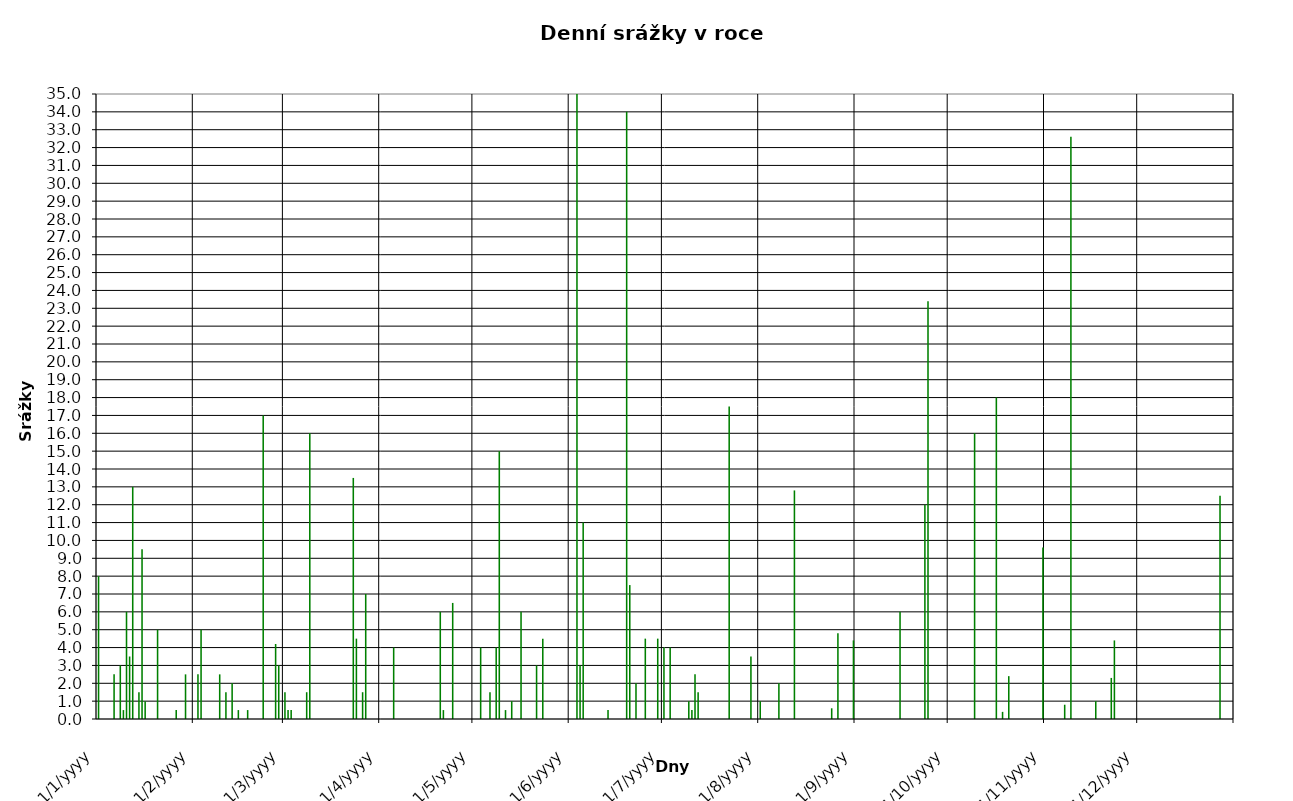
| Category | Series 0 |
|---|---|
| 2004-01-01 | 8 |
| 2004-01-02 | 0 |
| 2004-01-03 | 0 |
| 2004-01-04 | 0 |
| 2004-01-05 | 0 |
| 2004-01-06 | 2.5 |
| 2004-01-07 | 0 |
| 2004-01-08 | 3 |
| 2004-01-09 | 0.5 |
| 2004-01-10 | 6 |
| 2004-01-11 | 3.5 |
| 2004-01-12 | 13 |
| 2004-01-13 | 0 |
| 2004-01-14 | 1.5 |
| 2004-01-15 | 9.5 |
| 2004-01-16 | 1 |
| 2004-01-17 | 0 |
| 2004-01-18 | 0 |
| 2004-01-19 | 0 |
| 2004-01-20 | 5 |
| 2004-01-21 | 0 |
| 2004-01-22 | 0 |
| 2004-01-23 | 0 |
| 2004-01-24 | 0 |
| 2004-01-25 | 0 |
| 2004-01-26 | 0.5 |
| 2004-01-27 | 0 |
| 2004-01-28 | 0 |
| 2004-01-29 | 2.5 |
| 2004-01-30 | 0 |
| 2004-01-31 | 0 |
| 2004-02-01 | 0 |
| 2004-02-02 | 2.5 |
| 2004-02-03 | 5 |
| 2004-02-04 | 0 |
| 2004-02-05 | 0 |
| 2004-02-06 | 0 |
| 2004-02-07 | 0 |
| 2004-02-08 | 0 |
| 2004-02-09 | 2.5 |
| 2004-02-10 | 0 |
| 2004-02-11 | 1.5 |
| 2004-02-12 | 0 |
| 2004-02-13 | 2 |
| 2004-02-14 | 0 |
| 2004-02-15 | 0.5 |
| 2004-02-16 | 0 |
| 2004-02-17 | 0 |
| 2004-02-18 | 0.5 |
| 2004-02-19 | 0 |
| 2004-02-20 | 0 |
| 2004-02-21 | 0 |
| 2004-02-22 | 0 |
| 2004-02-23 | 17 |
| 2004-02-24 | 0 |
| 2004-02-25 | 0 |
| 2004-02-26 | 0 |
| 2004-02-27 | 4.2 |
| 2004-02-28 | 3 |
| 2004-02-29 | 0 |
| 2004-03-01 | 1.5 |
| 2004-03-02 | 0.5 |
| 2004-03-03 | 0.5 |
| 2004-03-04 | 0 |
| 2004-03-05 | 0 |
| 2004-03-06 | 0 |
| 2004-03-07 | 0 |
| 2004-03-08 | 1.5 |
| 2004-03-09 | 16 |
| 2004-03-10 | 0 |
| 2004-03-11 | 0 |
| 2004-03-12 | 0 |
| 2004-03-13 | 0 |
| 2004-03-14 | 0 |
| 2004-03-15 | 0 |
| 2004-03-16 | 0 |
| 2004-03-17 | 0 |
| 2004-03-18 | 0 |
| 2004-03-19 | 0 |
| 2004-03-20 | 0 |
| 2004-03-21 | 0 |
| 2004-03-22 | 0 |
| 2004-03-23 | 13.5 |
| 2004-03-24 | 4.5 |
| 2004-03-25 | 0 |
| 2004-03-26 | 1.5 |
| 2004-03-27 | 7 |
| 2004-03-28 | 0 |
| 2004-03-29 | 0 |
| 2004-03-30 | 0 |
| 2004-03-31 | 0 |
| 2004-04-01 | 0 |
| 2004-04-02 | 0 |
| 2004-04-03 | 0 |
| 2004-04-04 | 0 |
| 2004-04-05 | 4 |
| 2004-04-06 | 0 |
| 2004-04-07 | 0 |
| 2004-04-08 | 0 |
| 2004-04-09 | 0 |
| 2004-04-10 | 0 |
| 2004-04-11 | 0 |
| 2004-04-12 | 0 |
| 2004-04-13 | 0 |
| 2004-04-14 | 0 |
| 2004-04-15 | 0 |
| 2004-04-16 | 0 |
| 2004-04-17 | 0 |
| 2004-04-18 | 0 |
| 2004-04-19 | 0 |
| 2004-04-20 | 6 |
| 2004-04-21 | 0.5 |
| 2004-04-22 | 0 |
| 2004-04-23 | 0 |
| 2004-04-24 | 6.5 |
| 2004-04-25 | 0 |
| 2004-04-26 | 0 |
| 2004-04-27 | 0 |
| 2004-04-28 | 0 |
| 2004-04-29 | 0 |
| 2004-04-30 | 0 |
| 2004-05-01 | 0 |
| 2004-05-02 | 0 |
| 2004-05-03 | 4 |
| 2004-05-04 | 0 |
| 2004-05-05 | 0 |
| 2004-05-06 | 1.5 |
| 2004-05-07 | 0 |
| 2004-05-08 | 4 |
| 2004-05-09 | 15 |
| 2004-05-10 | 0 |
| 2004-05-11 | 0.5 |
| 2004-05-12 | 0 |
| 2004-05-13 | 1 |
| 2004-05-14 | 0 |
| 2004-05-15 | 0 |
| 2004-05-16 | 6 |
| 2004-05-17 | 0 |
| 2004-05-18 | 0 |
| 2004-05-19 | 0 |
| 2004-05-20 | 0 |
| 2004-05-21 | 3 |
| 2004-05-22 | 0 |
| 2004-05-23 | 4.5 |
| 2004-05-24 | 0 |
| 2004-05-25 | 0 |
| 2004-05-26 | 0 |
| 2004-05-27 | 0 |
| 2004-05-28 | 0 |
| 2004-05-29 | 0 |
| 2004-05-30 | 0 |
| 2004-05-31 | 0 |
| 2004-06-01 | 0 |
| 2004-06-02 | 0 |
| 2004-06-03 | 35 |
| 2004-06-04 | 3 |
| 2004-06-05 | 11 |
| 2004-06-06 | 0 |
| 2004-06-07 | 0 |
| 2004-06-08 | 0 |
| 2004-06-09 | 0 |
| 2004-06-10 | 0 |
| 2004-06-11 | 0 |
| 2004-06-12 | 0 |
| 2004-06-13 | 0.5 |
| 2004-06-14 | 0 |
| 2004-06-15 | 0 |
| 2004-06-16 | 0 |
| 2004-06-17 | 0 |
| 2004-06-18 | 0 |
| 2004-06-19 | 34 |
| 2004-06-20 | 7.5 |
| 2004-06-21 | 0 |
| 2004-06-22 | 2 |
| 2004-06-23 | 0 |
| 2004-06-24 | 0 |
| 2004-06-25 | 4.5 |
| 2004-06-26 | 0 |
| 2004-06-27 | 0 |
| 2004-06-28 | 0 |
| 2004-06-29 | 4.5 |
| 2004-06-30 | 0 |
| 2004-07-01 | 4 |
| 2004-07-02 | 0 |
| 2004-07-03 | 4 |
| 2004-07-04 | 0 |
| 2004-07-05 | 0 |
| 2004-07-06 | 0 |
| 2004-07-07 | 0 |
| 2004-07-08 | 0 |
| 2004-07-09 | 1 |
| 2004-07-10 | 0.5 |
| 2004-07-11 | 2.5 |
| 2004-07-12 | 1.5 |
| 2004-07-13 | 0 |
| 2004-07-14 | 0 |
| 2004-07-15 | 0 |
| 2004-07-16 | 0 |
| 2004-07-17 | 0 |
| 2004-07-18 | 0 |
| 2004-07-19 | 0 |
| 2004-07-20 | 0 |
| 2004-07-21 | 0 |
| 2004-07-22 | 17.5 |
| 2004-07-23 | 0 |
| 2004-07-24 | 0 |
| 2004-07-25 | 0 |
| 2004-07-26 | 0 |
| 2004-07-27 | 0 |
| 2004-07-28 | 0 |
| 2004-07-29 | 3.5 |
| 2004-07-30 | 0 |
| 2004-07-31 | 0 |
| 2004-08-01 | 1 |
| 2004-08-02 | 0 |
| 2004-08-03 | 0 |
| 2004-08-04 | 0 |
| 2004-08-05 | 0 |
| 2004-08-06 | 0 |
| 2004-08-07 | 2 |
| 2004-08-08 | 0 |
| 2004-08-09 | 0 |
| 2004-08-10 | 0 |
| 2004-08-11 | 0 |
| 2004-08-12 | 12.8 |
| 2004-08-13 | 0 |
| 2004-08-14 | 0 |
| 2004-08-15 | 0 |
| 2004-08-16 | 0 |
| 2004-08-17 | 0 |
| 2004-08-18 | 0 |
| 2004-08-19 | 0 |
| 2004-08-20 | 0 |
| 2004-08-21 | 0 |
| 2004-08-22 | 0 |
| 2004-08-23 | 0 |
| 2004-08-24 | 0.6 |
| 2004-08-25 | 0 |
| 2004-08-26 | 4.8 |
| 2004-08-27 | 0 |
| 2004-08-28 | 0 |
| 2004-08-29 | 0 |
| 2004-08-30 | 0 |
| 2004-08-31 | 4.4 |
| 2004-09-01 | 0 |
| 2004-09-02 | 0 |
| 2004-09-03 | 0 |
| 2004-09-04 | 0 |
| 2004-09-05 | 0 |
| 2004-09-06 | 0 |
| 2004-09-07 | 0 |
| 2004-09-08 | 0 |
| 2004-09-09 | 0 |
| 2004-09-10 | 0 |
| 2004-09-11 | 0 |
| 2004-09-12 | 0 |
| 2004-09-13 | 0 |
| 2004-09-14 | 0 |
| 2004-09-15 | 6 |
| 2004-09-16 | 0 |
| 2004-09-17 | 0 |
| 2004-09-18 | 0 |
| 2004-09-19 | 0 |
| 2004-09-20 | 0 |
| 2004-09-21 | 0 |
| 2004-09-22 | 0 |
| 2004-09-23 | 12 |
| 2004-09-24 | 23.4 |
| 2004-09-25 | 0 |
| 2004-09-26 | 0 |
| 2004-09-27 | 0 |
| 2004-09-28 | 0 |
| 2004-09-29 | 0 |
| 2004-09-30 | 0 |
| 2004-10-01 | 0 |
| 2004-10-02 | 0 |
| 2004-10-03 | 0 |
| 2004-10-04 | 0 |
| 2004-10-05 | 0 |
| 2004-10-06 | 0 |
| 2004-10-07 | 0 |
| 2004-10-08 | 0 |
| 2004-10-09 | 16 |
| 2004-10-10 | 0 |
| 2004-10-11 | 0 |
| 2004-10-12 | 0 |
| 2004-10-13 | 0 |
| 2004-10-14 | 0 |
| 2004-10-15 | 0 |
| 2004-10-16 | 18 |
| 2004-10-17 | 0 |
| 2004-10-18 | 0.4 |
| 2004-10-19 | 0 |
| 2004-10-20 | 2.4 |
| 2004-10-21 | 0 |
| 2004-10-22 | 0 |
| 2004-10-23 | 0 |
| 2004-10-24 | 0 |
| 2004-10-25 | 0 |
| 2004-10-26 | 0 |
| 2004-10-27 | 0 |
| 2004-10-28 | 0 |
| 2004-10-29 | 0 |
| 2004-10-30 | 0 |
| 2004-10-31 | 9.6 |
| 2004-11-01 | 0 |
| 2004-11-02 | 0 |
| 2004-11-03 | 0 |
| 2004-11-04 | 0 |
| 2004-11-05 | 0 |
| 2004-11-06 | 0 |
| 2004-11-07 | 0.8 |
| 2004-11-08 | 0 |
| 2004-11-09 | 32.6 |
| 2004-11-10 | 0 |
| 2004-11-11 | 0 |
| 2004-11-12 | 0 |
| 2004-11-13 | 0 |
| 2004-11-14 | 0 |
| 2004-11-15 | 0 |
| 2004-11-16 | 0 |
| 2004-11-17 | 1 |
| 2004-11-18 | 0 |
| 2004-11-19 | 0 |
| 2004-11-20 | 0 |
| 2004-11-21 | 0 |
| 2004-11-22 | 2.3 |
| 2004-11-23 | 4.4 |
| 2004-11-24 | 0 |
| 2004-11-25 | 0 |
| 2004-11-26 | 0 |
| 2004-11-27 | 0 |
| 2004-11-28 | 0 |
| 2004-11-29 | 0 |
| 2004-11-30 | 0 |
| 2004-12-01 | 0 |
| 2004-12-02 | 0 |
| 2004-12-03 | 0 |
| 2004-12-04 | 0 |
| 2004-12-05 | 0 |
| 2004-12-06 | 0 |
| 2004-12-07 | 0 |
| 2004-12-08 | 0 |
| 2004-12-09 | 0 |
| 2004-12-10 | 0 |
| 2004-12-11 | 0 |
| 2004-12-12 | 0 |
| 2004-12-13 | 0 |
| 2004-12-14 | 0 |
| 2004-12-15 | 0 |
| 2004-12-16 | 0 |
| 2004-12-17 | 0 |
| 2004-12-18 | 0 |
| 2004-12-19 | 0 |
| 2004-12-20 | 0 |
| 2004-12-21 | 0 |
| 2004-12-22 | 0 |
| 2004-12-23 | 0 |
| 2004-12-24 | 0 |
| 2004-12-25 | 0 |
| 2004-12-26 | 0 |
| 2004-12-27 | 12.5 |
| 2004-12-28 | 0 |
| 2004-12-29 | 0 |
| 2004-12-30 | 0 |
| 2004-12-31 | 0 |